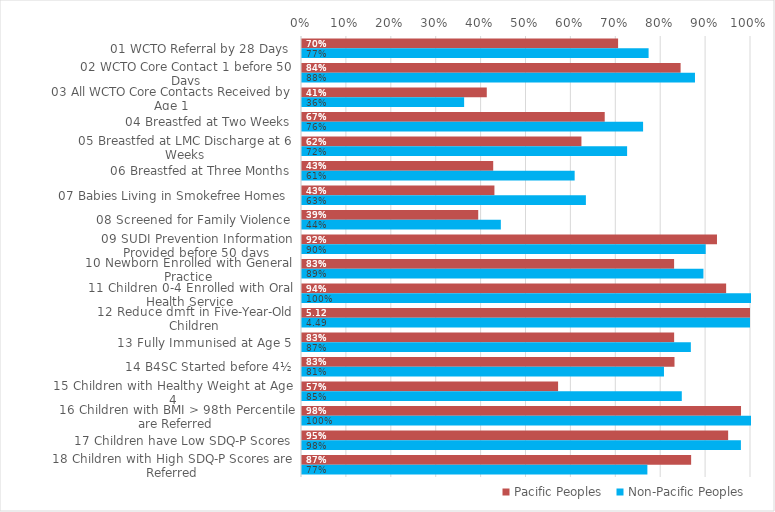
| Category | Pacific Peoples | Non-Pacific Peoples |
|---|---|---|
| 01 WCTO Referral by 28 Days | 0.704 | 0.772 |
| 02 WCTO Core Contact 1 before 50 Days | 0.843 | 0.875 |
| 03 All WCTO Core Contacts Received by Age 1 | 0.412 | 0.361 |
| 04 Breastfed at Two Weeks | 0.674 | 0.76 |
| 05 Breastfed at LMC Discharge at 6 Weeks | 0.622 | 0.724 |
| 06 Breastfed at Three Months | 0.426 | 0.607 |
| 07 Babies Living in Smokefree Homes  | 0.429 | 0.632 |
| 08 Screened for Family Violence | 0.392 | 0.443 |
| 09 SUDI Prevention Information Provided before 50 days | 0.924 | 0.899 |
| 10 Newborn Enrolled with General Practice | 0.829 | 0.894 |
| 11 Children 0-4 Enrolled with Oral Health Service | 0.945 | 1 |
| 12 Reduce dmft in Five-Year-Old Children | 5.118 | 4.491 |
| 13 Fully Immunised at Age 5 | 0.829 | 0.866 |
| 14 B4SC Started before 4½ | 0.83 | 0.806 |
| 15 Children with Healthy Weight at Age 4 | 0.57 | 0.846 |
| 16 Children with BMI > 98th Percentile are Referred | 0.978 | 1 |
| 17 Children have Low SDQ-P Scores | 0.949 | 0.978 |
| 18 Children with High SDQ-P Scores are Referred | 0.867 | 0.769 |